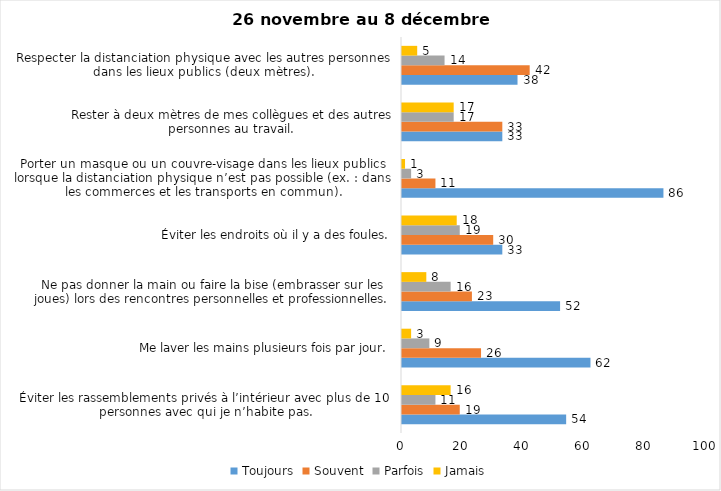
| Category | Toujours | Souvent | Parfois | Jamais |
|---|---|---|---|---|
| Éviter les rassemblements privés à l’intérieur avec plus de 10 personnes avec qui je n’habite pas. | 54 | 19 | 11 | 16 |
| Me laver les mains plusieurs fois par jour. | 62 | 26 | 9 | 3 |
| Ne pas donner la main ou faire la bise (embrasser sur les joues) lors des rencontres personnelles et professionnelles. | 52 | 23 | 16 | 8 |
| Éviter les endroits où il y a des foules. | 33 | 30 | 19 | 18 |
| Porter un masque ou un couvre-visage dans les lieux publics lorsque la distanciation physique n’est pas possible (ex. : dans les commerces et les transports en commun). | 86 | 11 | 3 | 1 |
| Rester à deux mètres de mes collègues et des autres personnes au travail. | 33 | 33 | 17 | 17 |
| Respecter la distanciation physique avec les autres personnes dans les lieux publics (deux mètres). | 38 | 42 | 14 | 5 |